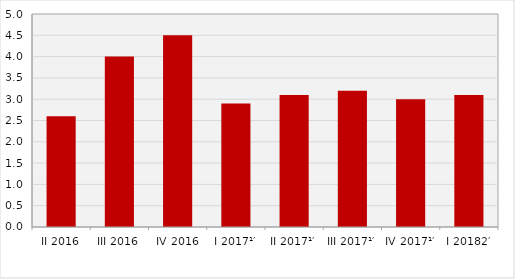
| Category | Стопе реалног раста БДП-а
Real growth rates of GDP |
|---|---|
| II 2016 | 2.6 |
| III 2016 | 4 |
| IV 2016 | 4.5 |
| I 2017¹′ | 2.9 |
| II 2017¹′ | 3.1 |
| III 2017¹′ | 3.2 |
| IV 2017¹′ | 3 |
| I 20182′ | 3.1 |